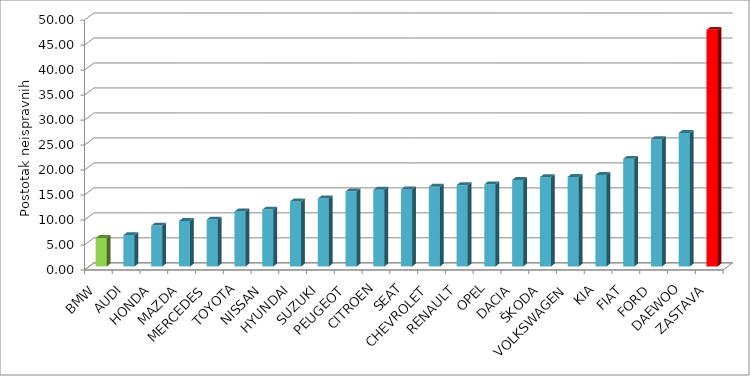
| Category | Series 4 |
|---|---|
| BMW | 5.695 |
| AUDI | 6.281 |
| HONDA | 8.181 |
| MAZDA | 9.102 |
| MERCEDES | 9.381 |
| TOYOTA | 11.002 |
| NISSAN | 11.371 |
| HYUNDAI | 13.021 |
| SUZUKI | 13.601 |
| PEUGEOT | 15.039 |
| CITROEN | 15.356 |
| SEAT | 15.421 |
| CHEVROLET | 15.958 |
| RENAULT | 16.277 |
| OPEL | 16.443 |
| DACIA | 17.312 |
| ŠKODA | 17.868 |
| VOLKSWAGEN | 17.926 |
| KIA | 18.319 |
| FIAT | 21.548 |
| FORD | 25.469 |
| DAEWOO | 26.725 |
| ZASTAVA | 47.357 |